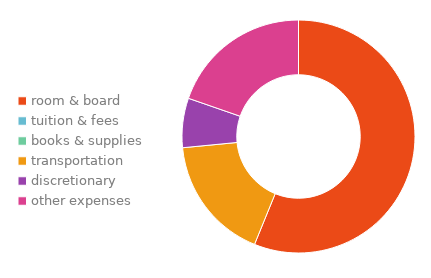
| Category | Series 0 |
|---|---|
| 0 | 0.253 |
| 1 | 0.336 |
| 2 | 0.146 |
| 3 | 0.078 |
| 4 | 0.076 |
| 5 | 0.112 |